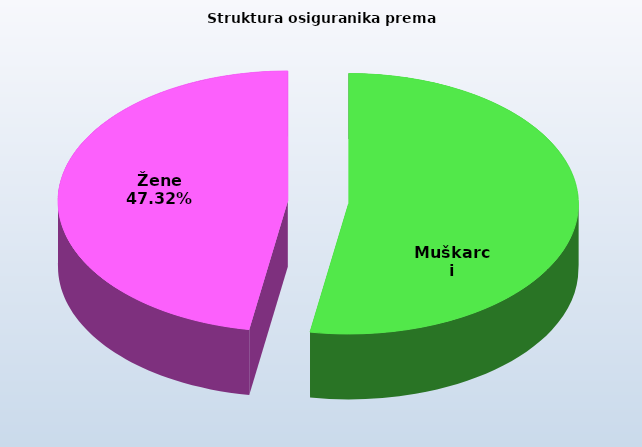
| Category | Series 0 |
|---|---|
| Muškarci | 825226 |
| Žene | 741220 |